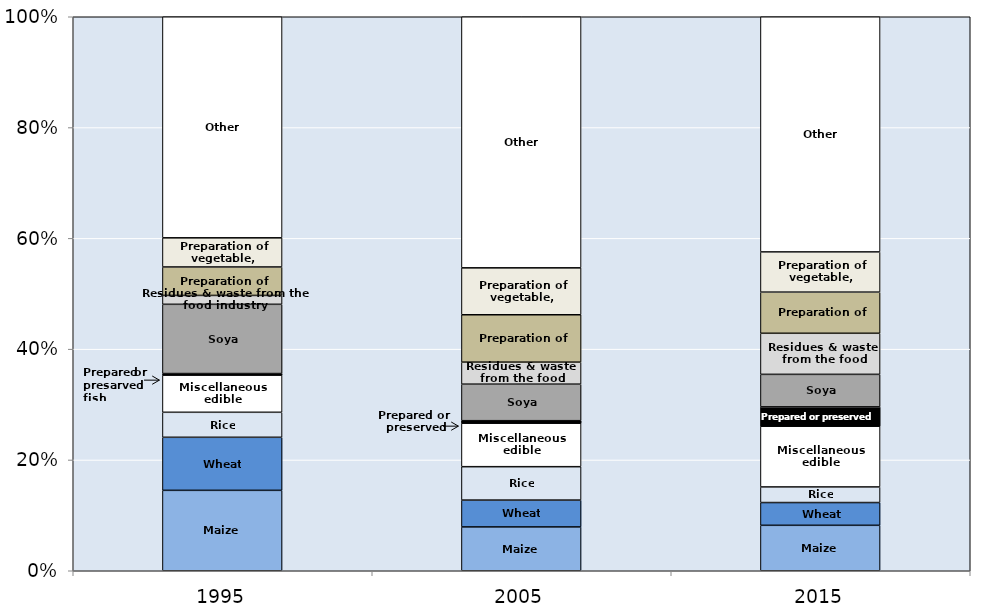
| Category | Maize (corn) | Wheat and meslin | Rice | Miscellaneous edible preparations | Prepared or preserved fish | Soya beans | Residues & waste from the food industry | Preparation of cereal | Preparation of vegetable, fruit, nuts  | Other |
|---|---|---|---|---|---|---|---|---|---|---|
| 1995.0 | 52180.726 | 34430.01 | 16219.034 | 24135.278 | 1009.439 | 44938.272 | 5763.719 | 18460.209 | 18919.629 | 143467.178 |
| 2005.0 | 48653.958 | 29800.271 | 37096.873 | 48321.388 | 2734.879 | 40545.572 | 24454.106 | 52601.518 | 52101.973 | 278769.031 |
| 2015.0 | 159221.821 | 79760.562 | 54613.892 | 212843.339 | 67647.812 | 113999.738 | 143925.474 | 144126.667 | 140889.406 | 823909.01 |